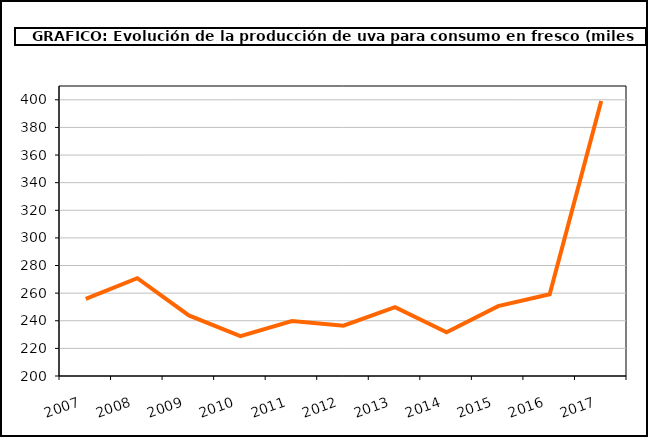
| Category | producción |
|---|---|
| 2007.0 | 255.88 |
| 2008.0 | 270.79 |
| 2009.0 | 243.908 |
| 2010.0 | 228.894 |
| 2011.0 | 239.733 |
| 2012.0 | 236.454 |
| 2013.0 | 249.825 |
| 2014.0 | 231.693 |
| 2015.0 | 250.597 |
| 2016.0 | 259.165 |
| 2017.0 | 399.144 |